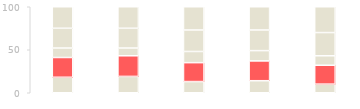
| Category | Series 0 | Series 1 | Series 2 | Series 3 | Series 4 |
|---|---|---|---|---|---|
| 2011.0 | 18 | 23 | 11 | 23 | 25 |
| 2012.0 | 19 | 24 | 9 | 23 | 25 |
| 2013.0 | 13 | 22 | 13 | 25 | 27 |
| 2014.0 | 14 | 23 | 12 | 24 | 27 |
| 2015.0 | 10 | 22 | 11 | 27 | 30 |